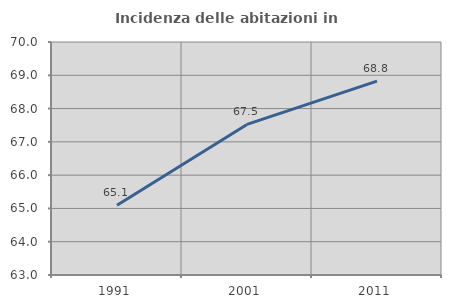
| Category | Incidenza delle abitazioni in proprietà  |
|---|---|
| 1991.0 | 65.094 |
| 2001.0 | 67.523 |
| 2011.0 | 68.825 |